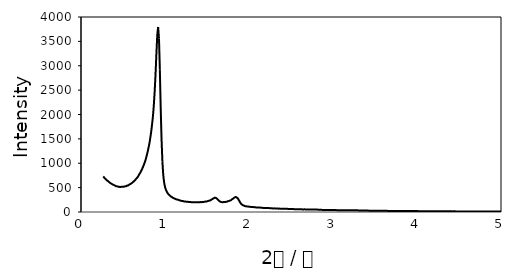
| Category | Series 0 |
|---|---|
| 0.263099998 | 729.557 |
| 0.273335239 | 711.875 |
| 0.28357048 | 690.286 |
| 0.29380572 | 675.234 |
| 0.304040961 | 656.328 |
| 0.314276202 | 641.823 |
| 0.324511442 | 630 |
| 0.334746683 | 611.962 |
| 0.344981924 | 598.759 |
| 0.355217164 | 586.858 |
| 0.365452405 | 578.481 |
| 0.375687646 | 566.589 |
| 0.385922886 | 555.677 |
| 0.396158127 | 549.714 |
| 0.406393368 | 540.738 |
| 0.416628608 | 529.08 |
| 0.426863849 | 525.694 |
| 0.43709909 | 524.418 |
| 0.447334331 | 518.212 |
| 0.457569571 | 514.974 |
| 0.467804812 | 512.752 |
| 0.478040053 | 516.328 |
| 0.488275293 | 519.045 |
| 0.498510534 | 519.219 |
| 0.508745775 | 518.741 |
| 0.518981015 | 524.488 |
| 0.529216256 | 528.394 |
| 0.539451497 | 530.069 |
| 0.549686737 | 542.509 |
| 0.559921978 | 543.542 |
| 0.570157219 | 555.868 |
| 0.580392459 | 568.672 |
| 0.5906277 | 576.398 |
| 0.600862941 | 589.106 |
| 0.611098181 | 601.293 |
| 0.621333422 | 617.335 |
| 0.631568663 | 633.62 |
| 0.641803904 | 648.62 |
| 0.652039144 | 672.752 |
| 0.662274385 | 691.398 |
| 0.672509626 | 712.63 |
| 0.682744866 | 739.236 |
| 0.692980107 | 771.814 |
| 0.703215348 | 799.609 |
| 0.713450588 | 834.401 |
| 0.723685829 | 865.946 |
| 0.73392107 | 908.559 |
| 0.74415631 | 950.495 |
| 0.754391551 | 997.127 |
| 0.764626792 | 1046.606 |
| 0.774862032 | 1106.788 |
| 0.785097273 | 1175.304 |
| 0.795332514 | 1248.49 |
| 0.805567754 | 1332.474 |
| 0.815802995 | 1421.458 |
| 0.826038236 | 1533.906 |
| 0.836273476 | 1656.701 |
| 0.846508717 | 1805.859 |
| 0.856743958 | 1970.877 |
| 0.866979199 | 2193.715 |
| 0.877214439 | 2477.361 |
| 0.88744968 | 2827.821 |
| 0.897684921 | 3246.71 |
| 0.907920161 | 3630.234 |
| 0.918155402 | 3796.155 |
| 0.928390643 | 3559.844 |
| 0.938625883 | 2927.205 |
| 0.948861124 | 2136.58 |
| 0.959096365 | 1477.847 |
| 0.969331605 | 1029.896 |
| 0.979566846 | 759.115 |
| 0.989802087 | 607.361 |
| 1.000037327 | 516.337 |
| 1.010272568 | 459.67 |
| 1.020507809 | 419.549 |
| 1.030743049 | 387.613 |
| 1.04097829 | 364.392 |
| 1.051213531 | 347.335 |
| 1.061448772 | 328.819 |
| 1.071684012 | 316.658 |
| 1.081919253 | 306.597 |
| 1.092154494 | 292.552 |
| 1.102389734 | 283.984 |
| 1.112624975 | 276.389 |
| 1.122860216 | 269.002 |
| 1.133095456 | 259.714 |
| 1.143330697 | 256.059 |
| 1.153565938 | 251.84 |
| 1.163801178 | 246.797 |
| 1.174036419 | 238.082 |
| 1.18427166 | 236.84 |
| 1.1945069 | 228.186 |
| 1.204742141 | 228.047 |
| 1.214977382 | 223.446 |
| 1.225212622 | 217.552 |
| 1.235447863 | 214.497 |
| 1.245683104 | 213.828 |
| 1.255918344 | 210.564 |
| 1.266153585 | 208.464 |
| 1.276388826 | 207.977 |
| 1.286624067 | 204.41 |
| 1.296859307 | 204.297 |
| 1.307094548 | 202.778 |
| 1.317329789 | 200.356 |
| 1.327565029 | 200.703 |
| 1.33780027 | 200.642 |
| 1.348035511 | 198.273 |
| 1.358270751 | 198.663 |
| 1.368505992 | 198.932 |
| 1.378741233 | 199.488 |
| 1.388976473 | 200.738 |
| 1.399211714 | 200.842 |
| 1.409446955 | 199.253 |
| 1.419682195 | 203.637 |
| 1.429917436 | 201.597 |
| 1.440152677 | 203.108 |
| 1.450387917 | 203.698 |
| 1.460623158 | 207.248 |
| 1.470858399 | 209.852 |
| 1.48109364 | 214.896 |
| 1.49132888 | 216.901 |
| 1.501564121 | 218.212 |
| 1.511799362 | 226.207 |
| 1.522034602 | 229.618 |
| 1.532269843 | 234.818 |
| 1.542505084 | 241.181 |
| 1.552740324 | 253.906 |
| 1.562975565 | 264.115 |
| 1.573210806 | 275.547 |
| 1.583446046 | 285 |
| 1.593681287 | 295.191 |
| 1.603916528 | 288.88 |
| 1.614151768 | 281.424 |
| 1.624387009 | 263.359 |
| 1.63462225 | 245.747 |
| 1.64485749 | 225.998 |
| 1.655092731 | 214.644 |
| 1.665327972 | 207.014 |
| 1.675563212 | 202.413 |
| 1.685798453 | 200.781 |
| 1.696033694 | 203.403 |
| 1.706268935 | 203.55 |
| 1.716504175 | 206.467 |
| 1.726739416 | 208.689 |
| 1.736974657 | 209.115 |
| 1.747209897 | 220.53 |
| 1.757445138 | 224.549 |
| 1.767680379 | 230.712 |
| 1.777915619 | 235.764 |
| 1.78815086 | 245.182 |
| 1.798386101 | 261.589 |
| 1.808621341 | 270.946 |
| 1.818856582 | 285.825 |
| 1.829091823 | 295.877 |
| 1.839327063 | 307.491 |
| 1.849562304 | 302.821 |
| 1.859797545 | 290.365 |
| 1.870032785 | 269.965 |
| 1.880268026 | 240.781 |
| 1.890503267 | 209.262 |
| 1.900738508 | 179.601 |
| 1.910973748 | 159.523 |
| 1.921208989 | 147.222 |
| 1.93144423 | 134.748 |
| 1.94167947 | 130.668 |
| 1.951914711 | 122.049 |
| 1.962149952 | 117.674 |
| 1.972385192 | 115.043 |
| 1.982620433 | 112.031 |
| 1.992855674 | 110.564 |
| 2.003090914 | 108.976 |
| 2.013326155 | 105.79 |
| 2.023561396 | 104.184 |
| 2.033796636 | 102.561 |
| 2.044031877 | 101.155 |
| 2.054267118 | 100.104 |
| 2.064502358 | 99.089 |
| 2.074737599 | 97.378 |
| 2.08497284 | 93.663 |
| 2.09520808 | 93.203 |
| 2.105443321 | 93.75 |
| 2.115678562 | 91.398 |
| 2.125913803 | 89.523 |
| 2.136149043 | 90.243 |
| 2.146384284 | 87.014 |
| 2.156619525 | 88.316 |
| 2.166854765 | 83.941 |
| 2.177090006 | 84.071 |
| 2.187325247 | 83.038 |
| 2.197560487 | 82.517 |
| 2.207795728 | 82.682 |
| 2.218030969 | 80.304 |
| 2.228266209 | 80.894 |
| 2.23850145 | 80.286 |
| 2.248736691 | 78.099 |
| 2.258971931 | 75.677 |
| 2.269207172 | 75.833 |
| 2.279442413 | 74.21 |
| 2.289677653 | 73.516 |
| 2.299912894 | 74.661 |
| 2.310148135 | 72.274 |
| 2.320383376 | 71.146 |
| 2.330618616 | 71.918 |
| 2.340853857 | 70.53 |
| 2.351089098 | 68.342 |
| 2.361324338 | 69.983 |
| 2.371559579 | 66.632 |
| 2.38179482 | 68.464 |
| 2.39203006 | 67.674 |
| 2.402265301 | 68.359 |
| 2.412500542 | 66.38 |
| 2.422735782 | 65.286 |
| 2.432971023 | 66.042 |
| 2.443206264 | 65.286 |
| 2.453441504 | 66.016 |
| 2.463676745 | 62.882 |
| 2.473911986 | 64.01 |
| 2.484147226 | 62.222 |
| 2.494382467 | 60.842 |
| 2.504617708 | 60.339 |
| 2.514852948 | 59.08 |
| 2.525088189 | 60.495 |
| 2.53532343 | 58.663 |
| 2.545558671 | 58.264 |
| 2.555793911 | 57.891 |
| 2.566029152 | 57.413 |
| 2.576264393 | 57.161 |
| 2.586499633 | 56.771 |
| 2.596734874 | 56.918 |
| 2.606970115 | 55.009 |
| 2.617205355 | 55.495 |
| 2.627440596 | 54.861 |
| 2.637675837 | 52.934 |
| 2.647911077 | 52.977 |
| 2.658146318 | 54.601 |
| 2.668381559 | 53.585 |
| 2.678616799 | 52.431 |
| 2.68885204 | 52.882 |
| 2.699087281 | 52.509 |
| 2.709322521 | 52.439 |
| 2.719557762 | 51.866 |
| 2.729793003 | 51.276 |
| 2.740028244 | 51.337 |
| 2.750263484 | 51.745 |
| 2.760498725 | 51.398 |
| 2.770733966 | 50.582 |
| 2.780969206 | 49.375 |
| 2.791204447 | 49.679 |
| 2.801439688 | 48.863 |
| 2.811674928 | 49.253 |
| 2.821910169 | 47.917 |
| 2.83214541 | 46.736 |
| 2.84238065 | 45.573 |
| 2.852615891 | 46.172 |
| 2.862851132 | 44.297 |
| 2.873086372 | 42.96 |
| 2.883321613 | 43.22 |
| 2.893556854 | 42.7 |
| 2.903792094 | 43.047 |
| 2.914027335 | 41.354 |
| 2.924262576 | 41.641 |
| 2.934497816 | 41.606 |
| 2.944733057 | 39.809 |
| 2.954968298 | 39.557 |
| 2.965203539 | 39.219 |
| 2.975438779 | 40.078 |
| 2.98567402 | 39.965 |
| 2.995909261 | 39.201 |
| 3.006144501 | 38.368 |
| 3.016379742 | 39.262 |
| 3.026614983 | 38.906 |
| 3.036850223 | 38.837 |
| 3.047085464 | 38.038 |
| 3.057320705 | 37.378 |
| 3.067555945 | 38.203 |
| 3.077791186 | 36.927 |
| 3.088026427 | 37.431 |
| 3.098261667 | 36.146 |
| 3.108496908 | 36.727 |
| 3.118732149 | 36.05 |
| 3.128967389 | 36.424 |
| 3.13920263 | 36.372 |
| 3.149437871 | 35.017 |
| 3.159673112 | 35.122 |
| 3.169908352 | 36.12 |
| 3.180143593 | 35.92 |
| 3.190378834 | 35.946 |
| 3.200614074 | 35.616 |
| 3.210849315 | 35.911 |
| 3.221084556 | 35.373 |
| 3.231319796 | 34.592 |
| 3.241555037 | 34.965 |
| 3.251790278 | 34.766 |
| 3.262025518 | 33.516 |
| 3.272260759 | 34.401 |
| 3.282496 | 33.733 |
| 3.29273124 | 33.568 |
| 3.302966481 | 32.951 |
| 3.313201722 | 32.231 |
| 3.323436962 | 31.589 |
| 3.333672203 | 32.326 |
| 3.343907444 | 31.389 |
| 3.354142684 | 30.252 |
| 3.364377925 | 30.807 |
| 3.374613166 | 30.894 |
| 3.384848407 | 28.837 |
| 3.395083647 | 29.774 |
| 3.405318888 | 28.602 |
| 3.415554129 | 28.767 |
| 3.425789369 | 27.873 |
| 3.43602461 | 27.092 |
| 3.446259851 | 27.734 |
| 3.456495091 | 27.674 |
| 3.466730332 | 26.476 |
| 3.476965573 | 26.224 |
| 3.487200813 | 26.51 |
| 3.497436054 | 26.207 |
| 3.507671295 | 25.851 |
| 3.517906535 | 25.99 |
| 3.528141776 | 25.295 |
| 3.538377017 | 24.47 |
| 3.548612257 | 23.741 |
| 3.558847498 | 24.766 |
| 3.569082739 | 25.009 |
| 3.57931798 | 24.757 |
| 3.58955322 | 24.271 |
| 3.599788461 | 23.889 |
| 3.610023702 | 23.524 |
| 3.620258942 | 23.568 |
| 3.630494183 | 23.316 |
| 3.640729424 | 23.403 |
| 3.650964664 | 22.908 |
| 3.661199905 | 22.266 |
| 3.671435146 | 22.821 |
| 3.681670386 | 22.813 |
| 3.691905627 | 22.908 |
| 3.702140868 | 21.667 |
| 3.712376108 | 22.179 |
| 3.722611349 | 21.528 |
| 3.73284659 | 21.276 |
| 3.74308183 | 22.101 |
| 3.753317071 | 20.929 |
| 3.763552312 | 20.79 |
| 3.773787552 | 20.434 |
| 3.784022793 | 20.807 |
| 3.794258034 | 20.503 |
| 3.804493275 | 20.339 |
| 3.814728515 | 20.035 |
| 3.824963756 | 19.21 |
| 3.835198997 | 18.906 |
| 3.845434237 | 19.201 |
| 3.855669478 | 20.017 |
| 3.865904719 | 19.557 |
| 3.876139959 | 19.323 |
| 3.8863752 | 18.95 |
| 3.896610441 | 19.523 |
| 3.906845681 | 19.071 |
| 3.917080922 | 19.063 |
| 3.927316163 | 18.715 |
| 3.937551403 | 18.62 |
| 3.947786644 | 18.75 |
| 3.958021885 | 18.212 |
| 3.968257125 | 18.854 |
| 3.978492366 | 18.403 |
| 3.988727607 | 18.203 |
| 3.998962848 | 18.116 |
| 4.009198088 | 18.29 |
| 4.019433329 | 17.517 |
| 4.02966857 | 16.997 |
| 4.03990381 | 17.708 |
| 4.050139051 | 17.726 |
| 4.060374292 | 17.248 |
| 4.070609532 | 17.431 |
| 4.080844773 | 17.179 |
| 4.091080014 | 16.701 |
| 4.101315254 | 16.641 |
| 4.111550495 | 17.561 |
| 4.121785736 | 16.58 |
| 4.132020976 | 16.701 |
| 4.142256217 | 15.964 |
| 4.152491458 | 15.764 |
| 4.162726698 | 16.25 |
| 4.172961939 | 15.903 |
| 4.18319718 | 15.495 |
| 4.19343242 | 15.347 |
| 4.203667661 | 15.425 |
| 4.213902902 | 15.573 |
| 4.224138143 | 15.408 |
| 4.234373383 | 14.644 |
| 4.244608624 | 14.792 |
| 4.254843865 | 14.852 |
| 4.265079105 | 14.601 |
| 4.275314346 | 15.122 |
| 4.285549587 | 14.748 |
| 4.295784827 | 14.67 |
| 4.306020068 | 14.201 |
| 4.316255309 | 14.375 |
| 4.326490549 | 14.036 |
| 4.33672579 | 14.132 |
| 4.346961031 | 14.575 |
| 4.357196271 | 14.089 |
| 4.367431512 | 13.767 |
| 4.377666753 | 13.698 |
| 4.387901993 | 13.385 |
| 4.398137234 | 13.75 |
| 4.408372475 | 13.75 |
| 4.418607716 | 12.665 |
| 4.428842956 | 13.03 |
| 4.439078197 | 13.125 |
| 4.449313438 | 13.29 |
| 4.459548678 | 12.726 |
| 4.469783919 | 11.97 |
| 4.48001916 | 12.752 |
| 4.4902544 | 12.04 |
| 4.500489641 | 12.387 |
| 4.510724882 | 12.769 |
| 4.520960122 | 12.023 |
| 4.531195363 | 12.448 |
| 4.541430604 | 12.127 |
| 4.551665844 | 12.161 |
| 4.561901085 | 11.979 |
| 4.572136326 | 11.649 |
| 4.582371566 | 12.318 |
| 4.592606807 | 11.736 |
| 4.602842048 | 12.135 |
| 4.613077288 | 11.892 |
| 4.623312529 | 11.198 |
| 4.63354777 | 11.589 |
| 4.643783011 | 11.415 |
| 4.654018251 | 11.241 |
| 4.664253492 | 11.753 |
| 4.674488733 | 11.519 |
| 4.684723973 | 10.668 |
| 4.694959214 | 10.877 |
| 4.705194455 | 11.345 |
| 4.715429695 | 11.085 |
| 4.725664936 | 10.729 |
| 4.735900177 | 10.885 |
| 4.746135417 | 10.495 |
| 4.756370658 | 10.616 |
| 4.766605899 | 10.295 |
| 4.776841139 | 10.182 |
| 4.78707638 | 10.434 |
| 4.797311621 | 9.887 |
| 4.807546861 | 10.295 |
| 4.817782102 | 10.451 |
| 4.828017343 | 10.174 |
| 4.838252584 | 9.852 |
| 4.848487824 | 10.547 |
| 4.858723065 | 9.158 |
| 4.868958306 | 10.443 |
| 4.879193546 | 9.87 |
| 4.889428787 | 9.818 |
| 4.899664028 | 9.661 |
| 4.909899268 | 9.783 |
| 4.920134509 | 9.661 |
| 4.93036975 | 9.896 |
| 4.94060499 | 9.063 |
| 4.950840231 | 9.635 |
| 4.961075472 | 9.618 |
| 4.971310712 | 9.818 |
| 4.981545953 | 9.245 |
| 4.991781194 | 8.984 |
| 5.002016434 | 9.679 |
| 5.012251675 | 9.74 |
| 5.022486916 | 9.201 |
| 5.032722156 | 8.776 |
| 5.042957397 | 9.609 |
| 5.053192638 | 8.984 |
| 5.063427879 | 9.115 |
| 5.073663119 | 8.889 |
| 5.08389836 | 8.984 |
| 5.094133601 | 8.602 |
| 5.104368841 | 9.054 |
| 5.114604082 | 8.663 |
| 5.124839323 | 8.915 |
| 5.135074563 | 8.724 |
| 5.145309804 | 8.628 |
| 5.155545045 | 8.403 |
| 5.165780285 | 8.229 |
| 5.176015526 | 8.785 |
| 5.186250767 | 8.49 |
| 5.196486007 | 8.481 |
| 5.206721248 | 8.359 |
| 5.216956489 | 8.082 |
| 5.227191729 | 8.203 |
| 5.23742697 | 8.29 |
| 5.247662211 | 7.943 |
| 5.257897452 | 7.804 |
| 5.268132692 | 8.09 |
| 5.278367933 | 8.342 |
| 5.288603174 | 7.786 |
| 5.298838414 | 7.639 |
| 5.309073655 | 7.622 |
| 5.319308896 | 8.082 |
| 5.329544136 | 7.613 |
| 5.339779377 | 7.595 |
| 5.350014618 | 7.925 |
| 5.360249858 | 7.517 |
| 5.370485099 | 8.047 |
| 5.38072034 | 7.387 |
| 5.39095558 | 7.231 |
| 5.401190821 | 7.04 |
| 5.411426062 | 7.309 |
| 5.421661302 | 7.127 |
| 5.431896543 | 7.127 |
| 5.442131784 | 7.5 |
| 5.452367024 | 7.153 |
| 5.462602265 | 7.231 |
| 5.472837506 | 6.884 |
| 5.483072747 | 6.944 |
| 5.493307987 | 7.049 |
| 5.503543228 | 6.936 |
| 5.513778469 | 7.309 |
| 5.524013709 | 6.901 |
| 5.53424895 | 6.814 |
| 5.544484191 | 7.023 |
| 5.554719431 | 7.092 |
| 5.564954672 | 7.075 |
| 5.575189913 | 6.91 |
| 5.585425153 | 6.675 |
| 5.595660394 | 6.918 |
| 5.605895635 | 6.623 |
| 5.616130875 | 6.658 |
| 5.626366116 | 6.493 |
| 5.636601357 | 6.693 |
| 5.646836597 | 6.536 |
| 5.657071838 | 6.345 |
| 5.667307079 | 6.606 |
| 5.67754232 | 6.71 |
| 5.68777756 | 6.641 |
| 5.698012801 | 6.519 |
| 5.708248042 | 6.345 |
| 5.718483282 | 6.502 |
| 5.728718523 | 6.571 |
| 5.738953764 | 6.372 |
| 5.749189004 | 6.389 |
| 5.759424245 | 6.328 |
| 5.769659486 | 6.085 |
| 5.779894726 | 6.389 |
| 5.790129967 | 6.337 |
| 5.800365208 | 6.398 |
| 5.810600448 | 6.389 |
| 5.820835689 | 5.972 |
| 5.83107093 | 6.441 |
| 5.84130617 | 6.293 |
| 5.851541411 | 6.102 |
| 5.861776652 | 5.738 |
| 5.872011892 | 5.391 |
| 5.882247133 | 6.345 |
| 5.892482374 | 5.842 |
| 5.902717615 | 6.285 |
| 5.912952855 | 5.99 |
| 5.923188096 | 6.05 |
| 5.933423337 | 5.877 |
| 5.943658577 | 5.955 |
| 5.953893818 | 5.911 |
| 5.964129059 | 5.894 |
| 5.974364299 | 5.92 |
| 5.98459954 | 6.059 |
| 5.994834781 | 5.625 |
| 6.005070021 | 5.46 |
| 6.015305262 | 5.573 |
| 6.025540503 | 5.738 |
| 6.035775743 | 5.339 |
| 6.046010984 | 5.347 |
| 6.056246225 | 5.582 |
| 6.066481465 | 5.347 |
| 6.076716706 | 5.799 |
| 6.086951947 | 5.321 |
| 6.097187188 | 5.538 |
| 6.107422428 | 5.686 |
| 6.117657669 | 5.451 |
| 6.12789291 | 5.104 |
| 6.13812815 | 5.017 |
| 6.148363391 | 5.217 |
| 6.158598632 | 5.477 |
| 6.168833872 | 5.408 |
| 6.179069113 | 5.182 |
| 6.189304354 | 5.2 |
| 6.199539594 | 4.965 |
| 6.209774835 | 5.286 |
| 6.220010076 | 5.026 |
| 6.230245316 | 5.286 |
| 6.240480557 | 5.269 |
| 6.250715798 | 4.991 |
| 6.260951038 | 5.217 |
| 6.271186279 | 4.575 |
| 6.28142152 | 5.313 |
| 6.29165676 | 4.922 |
| 6.301892001 | 4.931 |
| 6.312127242 | 4.861 |
| 6.322362483 | 5.052 |
| 6.332597723 | 5.182 |
| 6.342832964 | 4.774 |
| 6.353068205 | 4.991 |
| 6.363303445 | 4.74 |
| 6.373538686 | 4.774 |
| 6.383773927 | 4.991 |
| 6.394009167 | 4.661 |
| 6.404244408 | 4.818 |
| 6.414479649 | 4.8 |
| 6.424714889 | 4.939 |
| 6.43495013 | 4.748 |
| 6.445185371 | 4.54 |
| 6.455420611 | 4.531 |
| 6.465655852 | 4.627 |
| 6.475891093 | 4.818 |
| 6.486126333 | 4.661 |
| 6.496361574 | 4.462 |
| 6.506596815 | 4.436 |
| 6.516832056 | 4.375 |
| 6.527067296 | 4.74 |
| 6.537302537 | 4.74 |
| 6.547537778 | 4.609 |
| 6.557773018 | 4.323 |
| 6.568008259 | 4.427 |
| 6.5782435 | 4.644 |
| 6.58847874 | 4.644 |
| 6.598713981 | 4.67 |
| 6.608949222 | 4.453 |
| 6.619184462 | 4.705 |
| 6.629419703 | 4.444 |
| 6.639654944 | 4.392 |
| 6.649890184 | 4.41 |
| 6.660125425 | 4.627 |
| 6.670360666 | 4.74 |
| 6.680595906 | 4.436 |
| 6.690831147 | 4.531 |
| 6.701066388 | 4.271 |
| 6.711301629 | 4.401 |
| 6.721536869 | 4.245 |
| 6.73177211 | 4.332 |
| 6.742007351 | 4.523 |
| 6.752242591 | 3.698 |
| 6.762477832 | 4.323 |
| 6.772713073 | 4.384 |
| 6.782948313 | 4.227 |
| 6.793183554 | 4.366 |
| 6.803418795 | 4.115 |
| 6.813654035 | 4.141 |
| 6.823889276 | 4.227 |
| 6.834124517 | 4.184 |
| 6.844359757 | 3.863 |
| 6.854594998 | 3.993 |
| 6.864830239 | 4.115 |
| 6.875065479 | 4.236 |
| 6.88530072 | 3.967 |
| 6.895535961 | 4.253 |
| 6.905771201 | 4.054 |
| 6.916006442 | 4.028 |
| 6.926241683 | 4.002 |
| 6.936476924 | 4.028 |
| 6.946712164 | 3.984 |
| 6.956947405 | 3.993 |
| 6.967182646 | 4.028 |
| 6.977417886 | 3.724 |
| 6.987653127 | 4.097 |
| 6.997888368 | 4.141 |
| 7.008123608 | 3.958 |
| 7.018358849 | 3.889 |
| 7.02859409 | 4.106 |
| 7.03882933 | 4.149 |
| 7.049064571 | 3.872 |
| 7.059299812 | 4.201 |
| 7.069535052 | 3.733 |
| 7.079770293 | 3.793 |
| 7.090005534 | 4.549 |
| 7.100240774 | 3.915 |
| 7.110476015 | 3.655 |
| 7.120711256 | 3.932 |
| 7.130946497 | 3.681 |
| 7.141181737 | 4.019 |
| 7.151416978 | 3.819 |
| 7.161652219 | 3.741 |
| 7.171887459 | 3.802 |
| 7.1821227 | 3.984 |
| 7.192357941 | 3.889 |
| 7.202593181 | 3.689 |
| 7.212828422 | 3.776 |
| 7.223063663 | 3.802 |
| 7.233298903 | 3.759 |
| 7.243534144 | 3.767 |
| 7.253769385 | 3.793 |
| 7.264004625 | 3.924 |
| 7.274239866 | 4.106 |
| 7.284475107 | 4.002 |
| 7.294710347 | 3.559 |
| 7.304945588 | 3.646 |
| 7.315180829 | 3.698 |
| 7.325416069 | 3.542 |
| 7.33565131 | 4.045 |
| 7.345886551 | 3.802 |
| 7.356121792 | 3.872 |
| 7.366357032 | 3.542 |
| 7.376592273 | 4.045 |
| 7.386827514 | 3.62 |
| 7.397062754 | 3.776 |
| 7.407297995 | 3.681 |
| 7.417533236 | 3.516 |
| 7.427768476 | 3.542 |
| 7.438003717 | 3.585 |
| 7.448238958 | 3.655 |
| 7.458474198 | 3.837 |
| 7.468709439 | 3.403 |
| 7.47894468 | 3.524 |
| 7.48917992 | 3.767 |
| 7.499415161 | 3.637 |
| 7.509650402 | 3.585 |
| 7.519885642 | 3.594 |
| 7.530120883 | 3.585 |
| 7.540356124 | 3.88 |
| 7.550591365 | 3.394 |
| 7.560826605 | 3.411 |
| 7.571061846 | 3.29 |
| 7.581297087 | 3.594 |
| 7.591532327 | 3.438 |
| 7.601767568 | 3.464 |
| 7.612002809 | 3.455 |
| 7.622238049 | 3.689 |
| 7.63247329 | 3.533 |
| 7.642708531 | 3.29 |
| 7.652943771 | 3.49 |
| 7.663179012 | 3.212 |
| 7.673414253 | 3.42 |
| 7.683649493 | 3.438 |
| 7.693884734 | 3.411 |
| 7.704119975 | 3.516 |
| 7.714355215 | 3.385 |
| 7.724590456 | 3.307 |
| 7.734825697 | 3.498 |
| 7.745060937 | 3.533 |
| 7.755296178 | 3.559 |
| 7.765531419 | 3.342 |
| 7.77576666 | 3.802 |
| 7.7860019 | 3.62 |
| 7.796237141 | 3.238 |
| 7.806472382 | 3.611 |
| 7.816707622 | 3.29 |